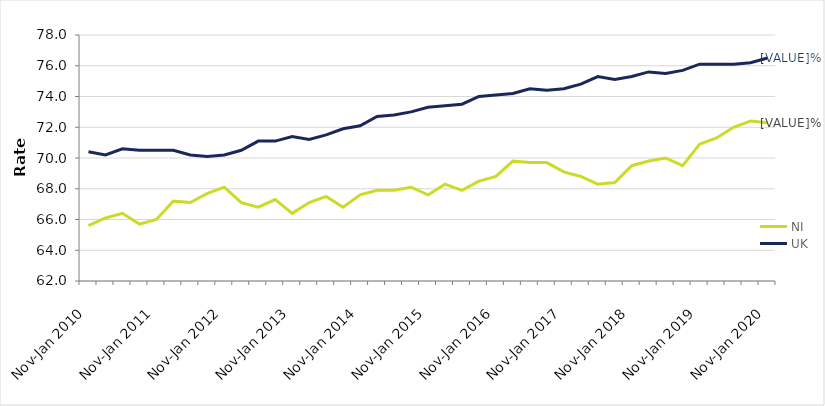
| Category | NI | UK |
|---|---|---|
| Nov-Jan 2010 | 65.6 | 70.4 |
| Feb-Apr 2010 | 66.1 | 70.2 |
| May-Jul 2010 | 66.4 | 70.6 |
| Aug-Oct 2010 | 65.7 | 70.5 |
| Nov-Jan 2011 | 66 | 70.5 |
| Feb-Apr 2011 | 67.2 | 70.5 |
| May-Jul 2011 | 67.1 | 70.2 |
| Aug-Oct 2011 | 67.7 | 70.1 |
| Nov-Jan 2012 | 68.1 | 70.2 |
| Feb-Apr 2012 | 67.1 | 70.5 |
| May-Jul 2012 | 66.8 | 71.1 |
| Aug-Oct 2012 | 67.3 | 71.1 |
| Nov-Jan 2013 | 66.4 | 71.4 |
| Feb-Apr 2013 | 67.1 | 71.2 |
| May-Jul 2013 | 67.5 | 71.5 |
| Aug-Oct 2013 | 66.8 | 71.9 |
| Nov-Jan 2014 | 67.6 | 72.1 |
| Feb-Apr 2014 | 67.9 | 72.7 |
| May-Jul 2014 | 67.9 | 72.8 |
| Aug-Oct 2014 | 68.1 | 73 |
| Nov-Jan 2015 | 67.6 | 73.3 |
| Feb-Apr 2015 | 68.3 | 73.4 |
| May-Jul 2015 | 67.9 | 73.5 |
| Aug-Oct 2015 | 68.5 | 74 |
| Nov-Jan 2016 | 68.8 | 74.1 |
| Feb-Apr 2016 | 69.8 | 74.2 |
| May-Jul 2016 | 69.7 | 74.5 |
| Aug-Oct 2016 | 69.7 | 74.4 |
| Nov-Jan 2017 | 69.1 | 74.5 |
| Feb-Apr 2017 | 68.8 | 74.8 |
| May-Jul 2017 | 68.3 | 75.3 |
| Aug-Oct 2017 | 68.4 | 75.1 |
| Nov-Jan 2018 | 69.5 | 75.3 |
| Feb-Apr 2018 | 69.8 | 75.6 |
| May-Jul 2018 | 70 | 75.5 |
| Aug-Oct 2018 | 69.5 | 75.7 |
| Nov-Jan 2019 | 70.9 | 76.1 |
| Feb-Apr 2019 | 71.3 | 76.1 |
| May-Jul 2019 | 72 | 76.1 |
| Aug-Oct 2019 | 72.4 | 76.2 |
| Nov-Jan 2020 | 72.3 | 76.5 |